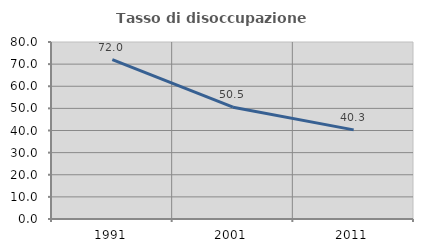
| Category | Tasso di disoccupazione giovanile  |
|---|---|
| 1991.0 | 72 |
| 2001.0 | 50.538 |
| 2011.0 | 40.278 |